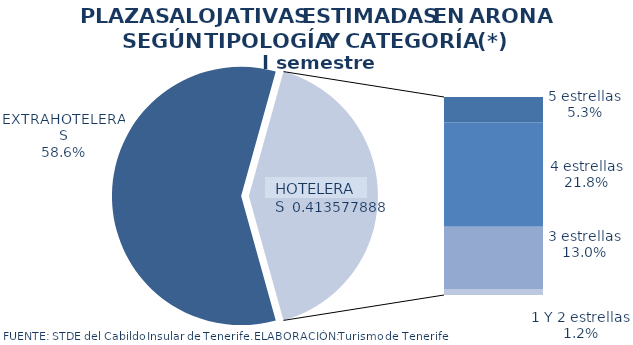
| Category | I semestre 2013 |
|---|---|
| EXTRAHOTELERAS | 0.586 |
| 5 estrellas | 0.053 |
| 4 estrellas | 0.218 |
| 3 estrellas | 0.13 |
| 1 Y 2 estrellas | 0.012 |